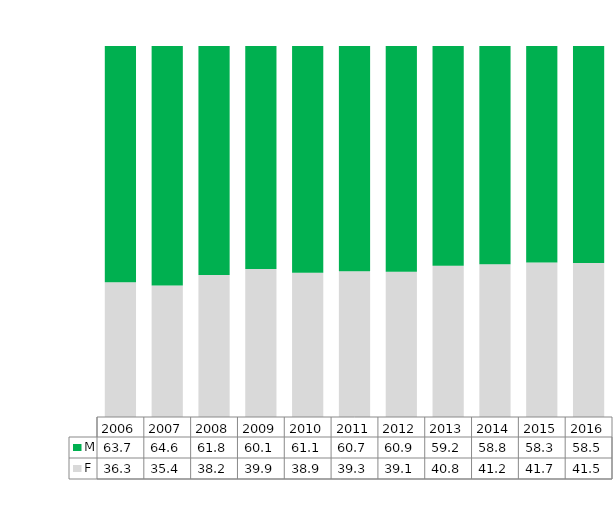
| Category | F | M |
|---|---|---|
| 2006.0 | 0.363 | 0.637 |
| 2007.0 | 0.354 | 0.646 |
| 2008.0 | 0.382 | 0.618 |
| 2009.0 | 0.399 | 0.601 |
| 2010.0 | 0.389 | 0.611 |
| 2011.0 | 0.393 | 0.607 |
| 2012.0 | 0.391 | 0.609 |
| 2013.0 | 0.408 | 0.592 |
| 2014.0 | 0.412 | 0.588 |
| 2015.0 | 0.417 | 0.583 |
| 2016.0 | 0.415 | 0.585 |